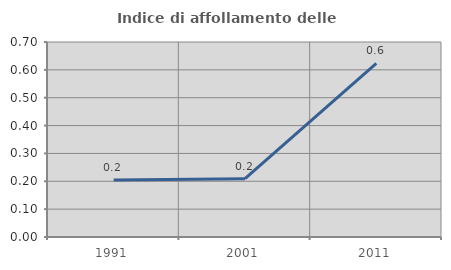
| Category | Indice di affollamento delle abitazioni  |
|---|---|
| 1991.0 | 0.205 |
| 2001.0 | 0.209 |
| 2011.0 | 0.624 |